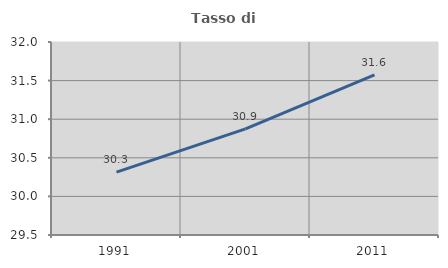
| Category | Tasso di occupazione   |
|---|---|
| 1991.0 | 30.315 |
| 2001.0 | 30.875 |
| 2011.0 | 31.573 |